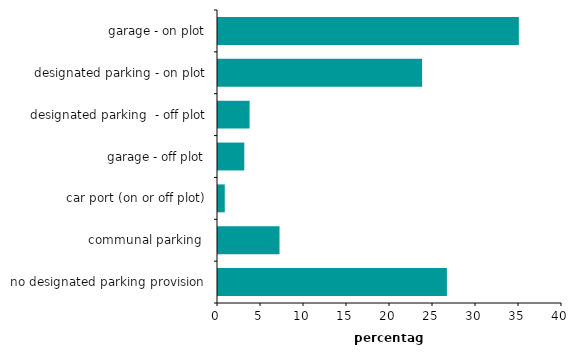
| Category | Series 0 |
|---|---|
| garage - on plot | 34.983 |
| designated parking - on plot | 23.733 |
| designated parking  - off plot | 3.673 |
| garage - off plot | 3.056 |
| car port (on or off plot) | 0.786 |
| communal parking  | 7.152 |
| no designated parking provision | 26.617 |